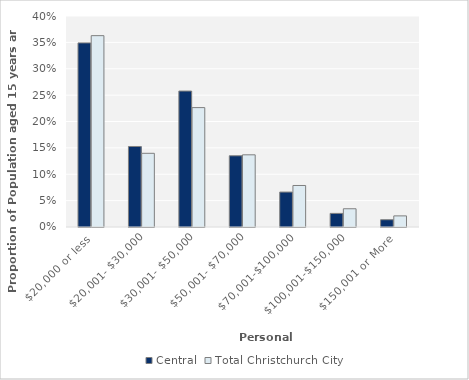
| Category | Central | Total Christchurch City |
|---|---|---|
| $20,000 or less | 0.349 | 0.363 |
| $20,001- $30,000 | 0.153 | 0.14 |
| $30,001- $50,000 | 0.258 | 0.226 |
| $50,001- $70,000 | 0.135 | 0.137 |
| $70,001-$100,000 | 0.066 | 0.079 |
| $100,001-$150,000 | 0.026 | 0.035 |
| $150,001 or More | 0.014 | 0.021 |